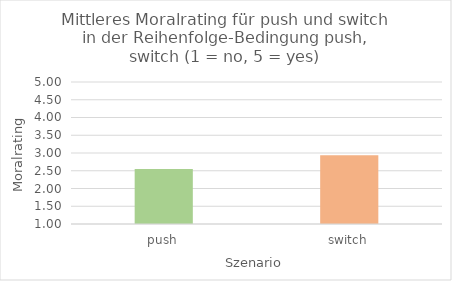
| Category | Mittelwert |
|---|---|
| push | 2.548 |
| switch | 2.935 |